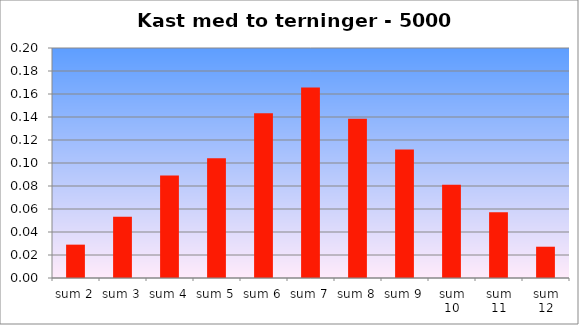
| Category | Rel. frek. |
|---|---|
| sum 2 | 0.029 |
| sum 3 | 0.053 |
| sum 4 | 0.089 |
| sum 5 | 0.104 |
| sum 6 | 0.143 |
| sum 7 | 0.166 |
| sum 8 | 0.138 |
| sum 9 | 0.112 |
| sum 10 | 0.081 |
| sum 11 | 0.057 |
| sum 12 | 0.027 |